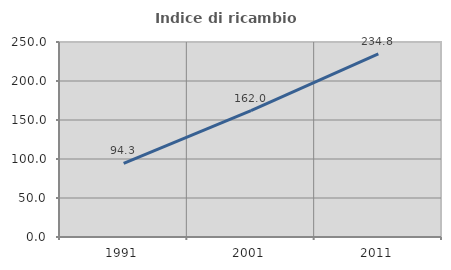
| Category | Indice di ricambio occupazionale  |
|---|---|
| 1991.0 | 94.286 |
| 2001.0 | 161.957 |
| 2011.0 | 234.831 |